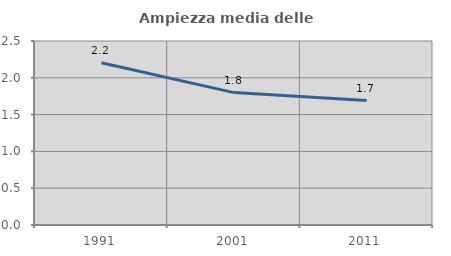
| Category | Ampiezza media delle famiglie |
|---|---|
| 1991.0 | 2.203 |
| 2001.0 | 1.799 |
| 2011.0 | 1.691 |